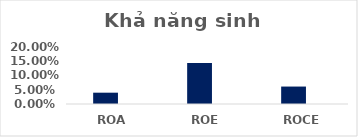
| Category | Series 0 | Series 1 | Series 2 | Series 3 |
|---|---|---|---|---|
| ROA | 0.04 |  |  |  |
| ROE | 0.144 |  |  |  |
| ROCE | 0.061 |  |  |  |